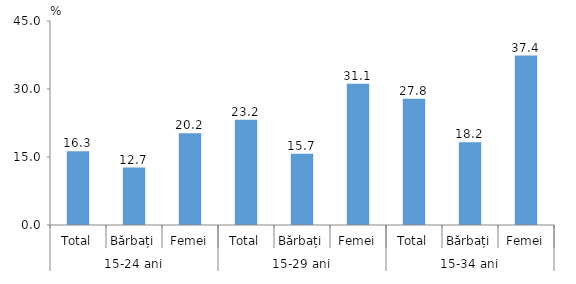
| Category | Series 0 |
|---|---|
| 0 | 16.283 |
| 1 | 12.657 |
| 2 | 20.243 |
| 3 | 23.232 |
| 4 | 15.71 |
| 5 | 31.142 |
| 6 | 27.828 |
| 7 | 18.238 |
| 8 | 37.368 |